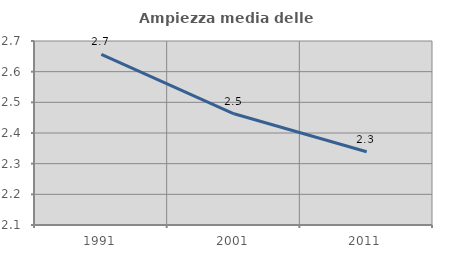
| Category | Ampiezza media delle famiglie |
|---|---|
| 1991.0 | 2.656 |
| 2001.0 | 2.463 |
| 2011.0 | 2.339 |